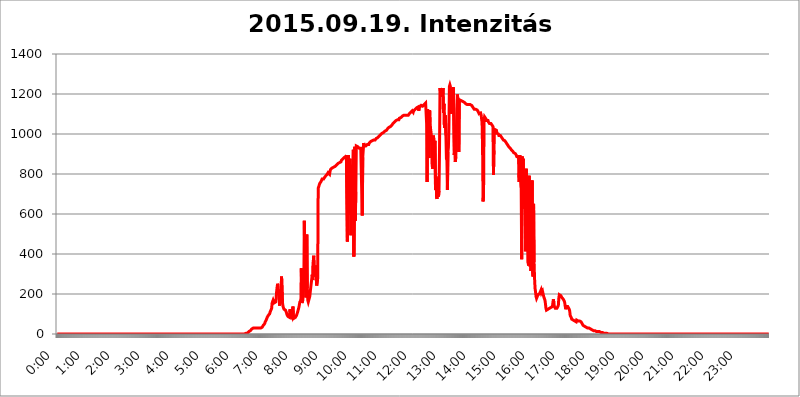
| Category | 2015.09.19. Intenzitás [W/m^2] |
|---|---|
| 0.0 | 0 |
| 0.0006944444444444445 | 0 |
| 0.001388888888888889 | 0 |
| 0.0020833333333333333 | 0 |
| 0.002777777777777778 | 0 |
| 0.003472222222222222 | 0 |
| 0.004166666666666667 | 0 |
| 0.004861111111111111 | 0 |
| 0.005555555555555556 | 0 |
| 0.0062499999999999995 | 0 |
| 0.006944444444444444 | 0 |
| 0.007638888888888889 | 0 |
| 0.008333333333333333 | 0 |
| 0.009027777777777779 | 0 |
| 0.009722222222222222 | 0 |
| 0.010416666666666666 | 0 |
| 0.011111111111111112 | 0 |
| 0.011805555555555555 | 0 |
| 0.012499999999999999 | 0 |
| 0.013194444444444444 | 0 |
| 0.013888888888888888 | 0 |
| 0.014583333333333332 | 0 |
| 0.015277777777777777 | 0 |
| 0.015972222222222224 | 0 |
| 0.016666666666666666 | 0 |
| 0.017361111111111112 | 0 |
| 0.018055555555555557 | 0 |
| 0.01875 | 0 |
| 0.019444444444444445 | 0 |
| 0.02013888888888889 | 0 |
| 0.020833333333333332 | 0 |
| 0.02152777777777778 | 0 |
| 0.022222222222222223 | 0 |
| 0.02291666666666667 | 0 |
| 0.02361111111111111 | 0 |
| 0.024305555555555556 | 0 |
| 0.024999999999999998 | 0 |
| 0.025694444444444447 | 0 |
| 0.02638888888888889 | 0 |
| 0.027083333333333334 | 0 |
| 0.027777777777777776 | 0 |
| 0.02847222222222222 | 0 |
| 0.029166666666666664 | 0 |
| 0.029861111111111113 | 0 |
| 0.030555555555555555 | 0 |
| 0.03125 | 0 |
| 0.03194444444444445 | 0 |
| 0.03263888888888889 | 0 |
| 0.03333333333333333 | 0 |
| 0.034027777777777775 | 0 |
| 0.034722222222222224 | 0 |
| 0.035416666666666666 | 0 |
| 0.036111111111111115 | 0 |
| 0.03680555555555556 | 0 |
| 0.0375 | 0 |
| 0.03819444444444444 | 0 |
| 0.03888888888888889 | 0 |
| 0.03958333333333333 | 0 |
| 0.04027777777777778 | 0 |
| 0.04097222222222222 | 0 |
| 0.041666666666666664 | 0 |
| 0.042361111111111106 | 0 |
| 0.04305555555555556 | 0 |
| 0.043750000000000004 | 0 |
| 0.044444444444444446 | 0 |
| 0.04513888888888889 | 0 |
| 0.04583333333333334 | 0 |
| 0.04652777777777778 | 0 |
| 0.04722222222222222 | 0 |
| 0.04791666666666666 | 0 |
| 0.04861111111111111 | 0 |
| 0.049305555555555554 | 0 |
| 0.049999999999999996 | 0 |
| 0.05069444444444445 | 0 |
| 0.051388888888888894 | 0 |
| 0.052083333333333336 | 0 |
| 0.05277777777777778 | 0 |
| 0.05347222222222222 | 0 |
| 0.05416666666666667 | 0 |
| 0.05486111111111111 | 0 |
| 0.05555555555555555 | 0 |
| 0.05625 | 0 |
| 0.05694444444444444 | 0 |
| 0.057638888888888885 | 0 |
| 0.05833333333333333 | 0 |
| 0.05902777777777778 | 0 |
| 0.059722222222222225 | 0 |
| 0.06041666666666667 | 0 |
| 0.061111111111111116 | 0 |
| 0.06180555555555556 | 0 |
| 0.0625 | 0 |
| 0.06319444444444444 | 0 |
| 0.06388888888888888 | 0 |
| 0.06458333333333334 | 0 |
| 0.06527777777777778 | 0 |
| 0.06597222222222222 | 0 |
| 0.06666666666666667 | 0 |
| 0.06736111111111111 | 0 |
| 0.06805555555555555 | 0 |
| 0.06874999999999999 | 0 |
| 0.06944444444444443 | 0 |
| 0.07013888888888889 | 0 |
| 0.07083333333333333 | 0 |
| 0.07152777777777779 | 0 |
| 0.07222222222222223 | 0 |
| 0.07291666666666667 | 0 |
| 0.07361111111111111 | 0 |
| 0.07430555555555556 | 0 |
| 0.075 | 0 |
| 0.07569444444444444 | 0 |
| 0.0763888888888889 | 0 |
| 0.07708333333333334 | 0 |
| 0.07777777777777778 | 0 |
| 0.07847222222222222 | 0 |
| 0.07916666666666666 | 0 |
| 0.0798611111111111 | 0 |
| 0.08055555555555556 | 0 |
| 0.08125 | 0 |
| 0.08194444444444444 | 0 |
| 0.08263888888888889 | 0 |
| 0.08333333333333333 | 0 |
| 0.08402777777777777 | 0 |
| 0.08472222222222221 | 0 |
| 0.08541666666666665 | 0 |
| 0.08611111111111112 | 0 |
| 0.08680555555555557 | 0 |
| 0.08750000000000001 | 0 |
| 0.08819444444444445 | 0 |
| 0.08888888888888889 | 0 |
| 0.08958333333333333 | 0 |
| 0.09027777777777778 | 0 |
| 0.09097222222222222 | 0 |
| 0.09166666666666667 | 0 |
| 0.09236111111111112 | 0 |
| 0.09305555555555556 | 0 |
| 0.09375 | 0 |
| 0.09444444444444444 | 0 |
| 0.09513888888888888 | 0 |
| 0.09583333333333333 | 0 |
| 0.09652777777777777 | 0 |
| 0.09722222222222222 | 0 |
| 0.09791666666666667 | 0 |
| 0.09861111111111111 | 0 |
| 0.09930555555555555 | 0 |
| 0.09999999999999999 | 0 |
| 0.10069444444444443 | 0 |
| 0.1013888888888889 | 0 |
| 0.10208333333333335 | 0 |
| 0.10277777777777779 | 0 |
| 0.10347222222222223 | 0 |
| 0.10416666666666667 | 0 |
| 0.10486111111111111 | 0 |
| 0.10555555555555556 | 0 |
| 0.10625 | 0 |
| 0.10694444444444444 | 0 |
| 0.1076388888888889 | 0 |
| 0.10833333333333334 | 0 |
| 0.10902777777777778 | 0 |
| 0.10972222222222222 | 0 |
| 0.1111111111111111 | 0 |
| 0.11180555555555556 | 0 |
| 0.11180555555555556 | 0 |
| 0.1125 | 0 |
| 0.11319444444444444 | 0 |
| 0.11388888888888889 | 0 |
| 0.11458333333333333 | 0 |
| 0.11527777777777777 | 0 |
| 0.11597222222222221 | 0 |
| 0.11666666666666665 | 0 |
| 0.1173611111111111 | 0 |
| 0.11805555555555557 | 0 |
| 0.11944444444444445 | 0 |
| 0.12013888888888889 | 0 |
| 0.12083333333333333 | 0 |
| 0.12152777777777778 | 0 |
| 0.12222222222222223 | 0 |
| 0.12291666666666667 | 0 |
| 0.12291666666666667 | 0 |
| 0.12361111111111112 | 0 |
| 0.12430555555555556 | 0 |
| 0.125 | 0 |
| 0.12569444444444444 | 0 |
| 0.12638888888888888 | 0 |
| 0.12708333333333333 | 0 |
| 0.16875 | 0 |
| 0.12847222222222224 | 0 |
| 0.12916666666666668 | 0 |
| 0.12986111111111112 | 0 |
| 0.13055555555555556 | 0 |
| 0.13125 | 0 |
| 0.13194444444444445 | 0 |
| 0.1326388888888889 | 0 |
| 0.13333333333333333 | 0 |
| 0.13402777777777777 | 0 |
| 0.13402777777777777 | 0 |
| 0.13472222222222222 | 0 |
| 0.13541666666666666 | 0 |
| 0.1361111111111111 | 0 |
| 0.13749999999999998 | 0 |
| 0.13819444444444443 | 0 |
| 0.1388888888888889 | 0 |
| 0.13958333333333334 | 0 |
| 0.14027777777777778 | 0 |
| 0.14097222222222222 | 0 |
| 0.14166666666666666 | 0 |
| 0.1423611111111111 | 0 |
| 0.14305555555555557 | 0 |
| 0.14375000000000002 | 0 |
| 0.14444444444444446 | 0 |
| 0.1451388888888889 | 0 |
| 0.1451388888888889 | 0 |
| 0.14652777777777778 | 0 |
| 0.14722222222222223 | 0 |
| 0.14791666666666667 | 0 |
| 0.1486111111111111 | 0 |
| 0.14930555555555555 | 0 |
| 0.15 | 0 |
| 0.15069444444444444 | 0 |
| 0.15138888888888888 | 0 |
| 0.15208333333333332 | 0 |
| 0.15277777777777776 | 0 |
| 0.15347222222222223 | 0 |
| 0.15416666666666667 | 0 |
| 0.15486111111111112 | 0 |
| 0.15555555555555556 | 0 |
| 0.15625 | 0 |
| 0.15694444444444444 | 0 |
| 0.15763888888888888 | 0 |
| 0.15833333333333333 | 0 |
| 0.15902777777777777 | 0 |
| 0.15972222222222224 | 0 |
| 0.16041666666666668 | 0 |
| 0.16111111111111112 | 0 |
| 0.16180555555555556 | 0 |
| 0.1625 | 0 |
| 0.16319444444444445 | 0 |
| 0.1638888888888889 | 0 |
| 0.16458333333333333 | 0 |
| 0.16527777777777777 | 0 |
| 0.16597222222222222 | 0 |
| 0.16666666666666666 | 0 |
| 0.1673611111111111 | 0 |
| 0.16805555555555554 | 0 |
| 0.16874999999999998 | 0 |
| 0.16944444444444443 | 0 |
| 0.17013888888888887 | 0 |
| 0.1708333333333333 | 0 |
| 0.17152777777777775 | 0 |
| 0.17222222222222225 | 0 |
| 0.1729166666666667 | 0 |
| 0.17361111111111113 | 0 |
| 0.17430555555555557 | 0 |
| 0.17500000000000002 | 0 |
| 0.17569444444444446 | 0 |
| 0.1763888888888889 | 0 |
| 0.17708333333333334 | 0 |
| 0.17777777777777778 | 0 |
| 0.17847222222222223 | 0 |
| 0.17916666666666667 | 0 |
| 0.1798611111111111 | 0 |
| 0.18055555555555555 | 0 |
| 0.18125 | 0 |
| 0.18194444444444444 | 0 |
| 0.1826388888888889 | 0 |
| 0.18333333333333335 | 0 |
| 0.1840277777777778 | 0 |
| 0.18472222222222223 | 0 |
| 0.18541666666666667 | 0 |
| 0.18611111111111112 | 0 |
| 0.18680555555555556 | 0 |
| 0.1875 | 0 |
| 0.18819444444444444 | 0 |
| 0.18888888888888888 | 0 |
| 0.18958333333333333 | 0 |
| 0.19027777777777777 | 0 |
| 0.1909722222222222 | 0 |
| 0.19166666666666665 | 0 |
| 0.19236111111111112 | 0 |
| 0.19305555555555554 | 0 |
| 0.19375 | 0 |
| 0.19444444444444445 | 0 |
| 0.1951388888888889 | 0 |
| 0.19583333333333333 | 0 |
| 0.19652777777777777 | 0 |
| 0.19722222222222222 | 0 |
| 0.19791666666666666 | 0 |
| 0.1986111111111111 | 0 |
| 0.19930555555555554 | 0 |
| 0.19999999999999998 | 0 |
| 0.20069444444444443 | 0 |
| 0.20138888888888887 | 0 |
| 0.2020833333333333 | 0 |
| 0.2027777777777778 | 0 |
| 0.2034722222222222 | 0 |
| 0.2041666666666667 | 0 |
| 0.20486111111111113 | 0 |
| 0.20555555555555557 | 0 |
| 0.20625000000000002 | 0 |
| 0.20694444444444446 | 0 |
| 0.2076388888888889 | 0 |
| 0.20833333333333334 | 0 |
| 0.20902777777777778 | 0 |
| 0.20972222222222223 | 0 |
| 0.21041666666666667 | 0 |
| 0.2111111111111111 | 0 |
| 0.21180555555555555 | 0 |
| 0.2125 | 0 |
| 0.21319444444444444 | 0 |
| 0.2138888888888889 | 0 |
| 0.21458333333333335 | 0 |
| 0.2152777777777778 | 0 |
| 0.21597222222222223 | 0 |
| 0.21666666666666667 | 0 |
| 0.21736111111111112 | 0 |
| 0.21805555555555556 | 0 |
| 0.21875 | 0 |
| 0.21944444444444444 | 0 |
| 0.22013888888888888 | 0 |
| 0.22083333333333333 | 0 |
| 0.22152777777777777 | 0 |
| 0.2222222222222222 | 0 |
| 0.22291666666666665 | 0 |
| 0.2236111111111111 | 0 |
| 0.22430555555555556 | 0 |
| 0.225 | 0 |
| 0.22569444444444445 | 0 |
| 0.2263888888888889 | 0 |
| 0.22708333333333333 | 0 |
| 0.22777777777777777 | 0 |
| 0.22847222222222222 | 0 |
| 0.22916666666666666 | 0 |
| 0.2298611111111111 | 0 |
| 0.23055555555555554 | 0 |
| 0.23124999999999998 | 0 |
| 0.23194444444444443 | 0 |
| 0.23263888888888887 | 0 |
| 0.2333333333333333 | 0 |
| 0.2340277777777778 | 0 |
| 0.2347222222222222 | 0 |
| 0.2354166666666667 | 0 |
| 0.23611111111111113 | 0 |
| 0.23680555555555557 | 0 |
| 0.23750000000000002 | 0 |
| 0.23819444444444446 | 0 |
| 0.2388888888888889 | 0 |
| 0.23958333333333334 | 0 |
| 0.24027777777777778 | 0 |
| 0.24097222222222223 | 0 |
| 0.24166666666666667 | 0 |
| 0.2423611111111111 | 0 |
| 0.24305555555555555 | 0 |
| 0.24375 | 0 |
| 0.24444444444444446 | 0 |
| 0.24513888888888888 | 0 |
| 0.24583333333333335 | 0 |
| 0.2465277777777778 | 0 |
| 0.24722222222222223 | 0 |
| 0.24791666666666667 | 0 |
| 0.24861111111111112 | 0 |
| 0.24930555555555556 | 0 |
| 0.25 | 0 |
| 0.25069444444444444 | 0 |
| 0.2513888888888889 | 0 |
| 0.2520833333333333 | 0 |
| 0.25277777777777777 | 0 |
| 0.2534722222222222 | 0 |
| 0.25416666666666665 | 0 |
| 0.2548611111111111 | 0 |
| 0.2555555555555556 | 0 |
| 0.25625000000000003 | 0 |
| 0.2569444444444445 | 0 |
| 0.2576388888888889 | 0 |
| 0.25833333333333336 | 0 |
| 0.2590277777777778 | 0 |
| 0.25972222222222224 | 0 |
| 0.2604166666666667 | 0 |
| 0.2611111111111111 | 0 |
| 0.26180555555555557 | 0 |
| 0.2625 | 0 |
| 0.26319444444444445 | 3.525 |
| 0.2638888888888889 | 3.525 |
| 0.26458333333333334 | 3.525 |
| 0.2652777777777778 | 3.525 |
| 0.2659722222222222 | 3.525 |
| 0.26666666666666666 | 3.525 |
| 0.2673611111111111 | 7.887 |
| 0.26805555555555555 | 7.887 |
| 0.26875 | 12.257 |
| 0.26944444444444443 | 12.257 |
| 0.2701388888888889 | 12.257 |
| 0.2708333333333333 | 16.636 |
| 0.27152777777777776 | 21.024 |
| 0.2722222222222222 | 21.024 |
| 0.27291666666666664 | 25.419 |
| 0.2736111111111111 | 25.419 |
| 0.2743055555555555 | 29.823 |
| 0.27499999999999997 | 29.823 |
| 0.27569444444444446 | 29.823 |
| 0.27638888888888885 | 29.823 |
| 0.27708333333333335 | 29.823 |
| 0.2777777777777778 | 29.823 |
| 0.27847222222222223 | 29.823 |
| 0.2791666666666667 | 29.823 |
| 0.2798611111111111 | 29.823 |
| 0.28055555555555556 | 29.823 |
| 0.28125 | 29.823 |
| 0.28194444444444444 | 29.823 |
| 0.2826388888888889 | 29.823 |
| 0.2833333333333333 | 29.823 |
| 0.28402777777777777 | 29.823 |
| 0.2847222222222222 | 29.823 |
| 0.28541666666666665 | 29.823 |
| 0.28611111111111115 | 29.823 |
| 0.28680555555555554 | 34.234 |
| 0.28750000000000003 | 34.234 |
| 0.2881944444444445 | 38.653 |
| 0.2888888888888889 | 43.079 |
| 0.28958333333333336 | 47.511 |
| 0.2902777777777778 | 47.511 |
| 0.29097222222222224 | 51.951 |
| 0.2916666666666667 | 60.85 |
| 0.2923611111111111 | 65.31 |
| 0.29305555555555557 | 69.775 |
| 0.29375 | 74.246 |
| 0.29444444444444445 | 83.205 |
| 0.2951388888888889 | 87.692 |
| 0.29583333333333334 | 92.184 |
| 0.2965277777777778 | 92.184 |
| 0.2972222222222222 | 96.682 |
| 0.29791666666666666 | 101.184 |
| 0.2986111111111111 | 110.201 |
| 0.29930555555555555 | 114.716 |
| 0.3 | 110.201 |
| 0.30069444444444443 | 128.284 |
| 0.3013888888888889 | 155.509 |
| 0.3020833333333333 | 155.509 |
| 0.30277777777777776 | 169.156 |
| 0.3034722222222222 | 164.605 |
| 0.30416666666666664 | 155.509 |
| 0.3048611111111111 | 155.509 |
| 0.3055555555555555 | 150.964 |
| 0.30624999999999997 | 160.056 |
| 0.3069444444444444 | 173.709 |
| 0.3076388888888889 | 210.182 |
| 0.30833333333333335 | 233 |
| 0.3090277777777778 | 251.251 |
| 0.30972222222222223 | 242.127 |
| 0.3104166666666667 | 210.182 |
| 0.3111111111111111 | 173.709 |
| 0.31180555555555556 | 141.884 |
| 0.3125 | 137.347 |
| 0.31319444444444444 | 146.423 |
| 0.3138888888888889 | 214.746 |
| 0.3145833333333333 | 287.709 |
| 0.31527777777777777 | 283.156 |
| 0.3159722222222222 | 155.509 |
| 0.31666666666666665 | 137.347 |
| 0.31736111111111115 | 132.814 |
| 0.31805555555555554 | 123.758 |
| 0.31875000000000003 | 119.235 |
| 0.3194444444444445 | 119.235 |
| 0.3201388888888889 | 119.235 |
| 0.32083333333333336 | 114.716 |
| 0.3215277777777778 | 105.69 |
| 0.32222222222222224 | 96.682 |
| 0.3229166666666667 | 92.184 |
| 0.3236111111111111 | 87.692 |
| 0.32430555555555557 | 83.205 |
| 0.325 | 83.205 |
| 0.32569444444444445 | 83.205 |
| 0.3263888888888889 | 123.758 |
| 0.32708333333333334 | 123.758 |
| 0.3277777777777778 | 92.184 |
| 0.3284722222222222 | 87.692 |
| 0.32916666666666666 | 83.205 |
| 0.3298611111111111 | 87.692 |
| 0.33055555555555555 | 137.347 |
| 0.33125 | 87.692 |
| 0.33194444444444443 | 78.722 |
| 0.3326388888888889 | 78.722 |
| 0.3333333333333333 | 83.205 |
| 0.3340277777777778 | 83.205 |
| 0.3347222222222222 | 87.692 |
| 0.3354166666666667 | 92.184 |
| 0.3361111111111111 | 96.682 |
| 0.3368055555555556 | 105.69 |
| 0.33749999999999997 | 114.716 |
| 0.33819444444444446 | 123.758 |
| 0.33888888888888885 | 132.814 |
| 0.33958333333333335 | 146.423 |
| 0.34027777777777773 | 160.056 |
| 0.34097222222222223 | 164.605 |
| 0.3416666666666666 | 169.156 |
| 0.3423611111111111 | 328.584 |
| 0.3430555555555555 | 155.509 |
| 0.34375 | 155.509 |
| 0.3444444444444445 | 169.156 |
| 0.3451388888888889 | 210.182 |
| 0.3458333333333334 | 251.251 |
| 0.34652777777777777 | 566.793 |
| 0.34722222222222227 | 328.584 |
| 0.34791666666666665 | 242.127 |
| 0.34861111111111115 | 182.82 |
| 0.34930555555555554 | 196.497 |
| 0.35000000000000003 | 497.836 |
| 0.3506944444444444 | 233 |
| 0.3513888888888889 | 169.156 |
| 0.3520833333333333 | 160.056 |
| 0.3527777777777778 | 169.156 |
| 0.3534722222222222 | 173.709 |
| 0.3541666666666667 | 187.378 |
| 0.3548611111111111 | 191.937 |
| 0.35555555555555557 | 233 |
| 0.35625 | 228.436 |
| 0.35694444444444445 | 228.436 |
| 0.3576388888888889 | 296.808 |
| 0.35833333333333334 | 269.49 |
| 0.3590277777777778 | 360.221 |
| 0.3597222222222222 | 391.685 |
| 0.36041666666666666 | 314.98 |
| 0.3611111111111111 | 328.584 |
| 0.36180555555555555 | 287.709 |
| 0.3625 | 342.162 |
| 0.36319444444444443 | 278.603 |
| 0.3638888888888889 | 242.127 |
| 0.3645833333333333 | 237.564 |
| 0.3652777777777778 | 278.603 |
| 0.3659722222222222 | 727.896 |
| 0.3666666666666667 | 735.89 |
| 0.3673611111111111 | 743.859 |
| 0.3680555555555556 | 751.803 |
| 0.36874999999999997 | 755.766 |
| 0.36944444444444446 | 755.766 |
| 0.37013888888888885 | 763.674 |
| 0.37083333333333335 | 767.62 |
| 0.37152777777777773 | 775.492 |
| 0.37222222222222223 | 775.492 |
| 0.3729166666666666 | 775.492 |
| 0.3736111111111111 | 775.492 |
| 0.3743055555555555 | 775.492 |
| 0.375 | 779.42 |
| 0.3756944444444445 | 787.258 |
| 0.3763888888888889 | 787.258 |
| 0.3770833333333334 | 787.258 |
| 0.37777777777777777 | 795.074 |
| 0.37847222222222227 | 795.074 |
| 0.37916666666666665 | 798.974 |
| 0.37986111111111115 | 806.757 |
| 0.38055555555555554 | 806.757 |
| 0.38125000000000003 | 806.757 |
| 0.3819444444444444 | 798.974 |
| 0.3826388888888889 | 814.519 |
| 0.3833333333333333 | 822.26 |
| 0.3840277777777778 | 822.26 |
| 0.3847222222222222 | 826.123 |
| 0.3854166666666667 | 829.981 |
| 0.3861111111111111 | 829.981 |
| 0.38680555555555557 | 833.834 |
| 0.3875 | 833.834 |
| 0.38819444444444445 | 833.834 |
| 0.3888888888888889 | 833.834 |
| 0.38958333333333334 | 837.682 |
| 0.3902777777777778 | 837.682 |
| 0.3909722222222222 | 841.526 |
| 0.39166666666666666 | 845.365 |
| 0.3923611111111111 | 845.365 |
| 0.39305555555555555 | 845.365 |
| 0.39375 | 853.029 |
| 0.39444444444444443 | 853.029 |
| 0.3951388888888889 | 853.029 |
| 0.3958333333333333 | 856.855 |
| 0.3965277777777778 | 860.676 |
| 0.3972222222222222 | 860.676 |
| 0.3979166666666667 | 860.676 |
| 0.3986111111111111 | 868.305 |
| 0.3993055555555556 | 868.305 |
| 0.39999999999999997 | 872.114 |
| 0.40069444444444446 | 875.918 |
| 0.40138888888888885 | 875.918 |
| 0.40208333333333335 | 879.719 |
| 0.40277777777777773 | 883.516 |
| 0.40347222222222223 | 887.309 |
| 0.4041666666666666 | 887.309 |
| 0.4048611111111111 | 887.309 |
| 0.4055555555555555 | 894.885 |
| 0.40625 | 894.885 |
| 0.4069444444444445 | 462.786 |
| 0.4076388888888889 | 868.305 |
| 0.4083333333333334 | 894.885 |
| 0.40902777777777777 | 795.074 |
| 0.40972222222222227 | 596.45 |
| 0.41041666666666665 | 875.918 |
| 0.41111111111111115 | 826.123 |
| 0.41180555555555554 | 493.475 |
| 0.41250000000000003 | 845.365 |
| 0.4131944444444444 | 711.832 |
| 0.4138888888888889 | 683.473 |
| 0.4145833333333333 | 814.519 |
| 0.4152777777777778 | 921.298 |
| 0.4159722222222222 | 387.202 |
| 0.4166666666666667 | 588.009 |
| 0.4173611111111111 | 936.33 |
| 0.41805555555555557 | 566.793 |
| 0.41875 | 711.832 |
| 0.41944444444444445 | 940.082 |
| 0.4201388888888889 | 943.832 |
| 0.42083333333333334 | 940.082 |
| 0.4215277777777778 | 936.33 |
| 0.4222222222222222 | 932.576 |
| 0.42291666666666666 | 932.576 |
| 0.4236111111111111 | 928.819 |
| 0.42430555555555555 | 928.819 |
| 0.425 | 928.819 |
| 0.42569444444444443 | 928.819 |
| 0.4263888888888889 | 932.576 |
| 0.4270833333333333 | 932.576 |
| 0.4277777777777778 | 592.233 |
| 0.4284722222222222 | 883.516 |
| 0.4291666666666667 | 879.719 |
| 0.4298611111111111 | 955.071 |
| 0.4305555555555556 | 940.082 |
| 0.43124999999999997 | 940.082 |
| 0.43194444444444446 | 943.832 |
| 0.43263888888888885 | 940.082 |
| 0.43333333333333335 | 943.832 |
| 0.43402777777777773 | 943.832 |
| 0.43472222222222223 | 947.58 |
| 0.4354166666666666 | 947.58 |
| 0.4361111111111111 | 947.58 |
| 0.4368055555555555 | 947.58 |
| 0.4375 | 955.071 |
| 0.4381944444444445 | 958.814 |
| 0.4388888888888889 | 958.814 |
| 0.4395833333333334 | 962.555 |
| 0.44027777777777777 | 966.295 |
| 0.44097222222222227 | 966.295 |
| 0.44166666666666665 | 966.295 |
| 0.44236111111111115 | 966.295 |
| 0.44305555555555554 | 970.034 |
| 0.44375000000000003 | 970.034 |
| 0.4444444444444444 | 966.295 |
| 0.4451388888888889 | 970.034 |
| 0.4458333333333333 | 970.034 |
| 0.4465277777777778 | 973.772 |
| 0.4472222222222222 | 977.508 |
| 0.4479166666666667 | 977.508 |
| 0.4486111111111111 | 977.508 |
| 0.44930555555555557 | 981.244 |
| 0.45 | 984.98 |
| 0.45069444444444445 | 984.98 |
| 0.4513888888888889 | 988.714 |
| 0.45208333333333334 | 992.448 |
| 0.4527777777777778 | 992.448 |
| 0.4534722222222222 | 996.182 |
| 0.45416666666666666 | 996.182 |
| 0.4548611111111111 | 999.916 |
| 0.45555555555555555 | 1003.65 |
| 0.45625 | 999.916 |
| 0.45694444444444443 | 1007.383 |
| 0.4576388888888889 | 1007.383 |
| 0.4583333333333333 | 1007.383 |
| 0.4590277777777778 | 1011.118 |
| 0.4597222222222222 | 1014.852 |
| 0.4604166666666667 | 1014.852 |
| 0.4611111111111111 | 1014.852 |
| 0.4618055555555556 | 1018.587 |
| 0.46249999999999997 | 1022.323 |
| 0.46319444444444446 | 1026.06 |
| 0.46388888888888885 | 1029.798 |
| 0.46458333333333335 | 1029.798 |
| 0.46527777777777773 | 1033.537 |
| 0.46597222222222223 | 1033.537 |
| 0.4666666666666666 | 1033.537 |
| 0.4673611111111111 | 1037.277 |
| 0.4680555555555555 | 1037.277 |
| 0.46875 | 1041.019 |
| 0.4694444444444445 | 1044.762 |
| 0.4701388888888889 | 1044.762 |
| 0.4708333333333334 | 1052.255 |
| 0.47152777777777777 | 1052.255 |
| 0.47222222222222227 | 1056.004 |
| 0.47291666666666665 | 1059.756 |
| 0.47361111111111115 | 1059.756 |
| 0.47430555555555554 | 1063.51 |
| 0.47500000000000003 | 1067.267 |
| 0.4756944444444444 | 1067.267 |
| 0.4763888888888889 | 1067.267 |
| 0.4770833333333333 | 1071.027 |
| 0.4777777777777778 | 1071.027 |
| 0.4784722222222222 | 1071.027 |
| 0.4791666666666667 | 1071.027 |
| 0.4798611111111111 | 1078.555 |
| 0.48055555555555557 | 1078.555 |
| 0.48125 | 1082.324 |
| 0.48194444444444445 | 1082.324 |
| 0.4826388888888889 | 1086.097 |
| 0.48333333333333334 | 1086.097 |
| 0.4840277777777778 | 1089.873 |
| 0.4847222222222222 | 1093.653 |
| 0.48541666666666666 | 1093.653 |
| 0.4861111111111111 | 1093.653 |
| 0.48680555555555555 | 1093.653 |
| 0.4875 | 1093.653 |
| 0.48819444444444443 | 1093.653 |
| 0.4888888888888889 | 1089.873 |
| 0.4895833333333333 | 1089.873 |
| 0.4902777777777778 | 1093.653 |
| 0.4909722222222222 | 1097.437 |
| 0.4916666666666667 | 1097.437 |
| 0.4923611111111111 | 1093.653 |
| 0.4930555555555556 | 1097.437 |
| 0.49374999999999997 | 1101.226 |
| 0.49444444444444446 | 1105.019 |
| 0.49513888888888885 | 1105.019 |
| 0.49583333333333335 | 1108.816 |
| 0.49652777777777773 | 1112.618 |
| 0.49722222222222223 | 1112.618 |
| 0.4979166666666666 | 1116.426 |
| 0.4986111111111111 | 1112.618 |
| 0.4993055555555555 | 1108.816 |
| 0.5 | 1116.426 |
| 0.5006944444444444 | 1116.426 |
| 0.5013888888888889 | 1116.426 |
| 0.5020833333333333 | 1124.056 |
| 0.5027777777777778 | 1124.056 |
| 0.5034722222222222 | 1127.879 |
| 0.5041666666666667 | 1131.708 |
| 0.5048611111111111 | 1127.879 |
| 0.5055555555555555 | 1131.708 |
| 0.50625 | 1135.543 |
| 0.5069444444444444 | 1116.426 |
| 0.5076388888888889 | 1127.879 |
| 0.5083333333333333 | 1135.543 |
| 0.5090277777777777 | 1131.708 |
| 0.5097222222222222 | 1139.384 |
| 0.5104166666666666 | 1143.232 |
| 0.5111111111111112 | 1143.232 |
| 0.5118055555555555 | 1143.232 |
| 0.5125000000000001 | 1139.384 |
| 0.5131944444444444 | 1139.384 |
| 0.513888888888889 | 1143.232 |
| 0.5145833333333333 | 1147.086 |
| 0.5152777777777778 | 1147.086 |
| 0.5159722222222222 | 1147.086 |
| 0.5166666666666667 | 1154.814 |
| 0.517361111111111 | 1154.814 |
| 0.5180555555555556 | 1052.255 |
| 0.5187499999999999 | 759.723 |
| 0.5194444444444445 | 1124.056 |
| 0.5201388888888888 | 977.508 |
| 0.5208333333333334 | 925.06 |
| 0.5215277777777778 | 879.719 |
| 0.5222222222222223 | 1120.238 |
| 0.5229166666666667 | 1056.004 |
| 0.5236111111111111 | 1026.06 |
| 0.5243055555555556 | 1007.383 |
| 0.525 | 973.772 |
| 0.5256944444444445 | 853.029 |
| 0.5263888888888889 | 826.123 |
| 0.5270833333333333 | 906.223 |
| 0.5277777777777778 | 992.448 |
| 0.5284722222222222 | 917.534 |
| 0.5291666666666667 | 955.071 |
| 0.5298611111111111 | 966.295 |
| 0.5305555555555556 | 719.877 |
| 0.53125 | 787.258 |
| 0.5319444444444444 | 687.544 |
| 0.5326388888888889 | 675.311 |
| 0.5333333333333333 | 723.889 |
| 0.5340277777777778 | 779.42 |
| 0.5347222222222222 | 687.544 |
| 0.5354166666666667 | 715.858 |
| 0.5361111111111111 | 909.996 |
| 0.5368055555555555 | 1229.899 |
| 0.5375 | 1213.804 |
| 0.5381944444444444 | 1225.859 |
| 0.5388888888888889 | 1225.859 |
| 0.5395833333333333 | 1221.83 |
| 0.5402777777777777 | 1186.03 |
| 0.5409722222222222 | 1229.899 |
| 0.5416666666666666 | 1105.019 |
| 0.5423611111111112 | 1150.946 |
| 0.5430555555555555 | 1029.798 |
| 0.5437500000000001 | 1086.097 |
| 0.5444444444444444 | 1093.653 |
| 0.545138888888889 | 992.448 |
| 0.5458333333333333 | 875.918 |
| 0.5465277777777778 | 868.305 |
| 0.5472222222222222 | 719.877 |
| 0.5479166666666667 | 909.996 |
| 0.548611111111111 | 932.576 |
| 0.5493055555555556 | 1029.798 |
| 0.5499999999999999 | 1238.014 |
| 0.5506944444444445 | 1246.176 |
| 0.5513888888888888 | 1238.014 |
| 0.5520833333333334 | 1154.814 |
| 0.5527777777777778 | 1101.226 |
| 0.5534722222222223 | 1229.899 |
| 0.5541666666666667 | 1108.816 |
| 0.5548611111111111 | 1221.83 |
| 0.5555555555555556 | 1233.951 |
| 0.55625 | 1229.899 |
| 0.5569444444444445 | 894.885 |
| 0.5576388888888889 | 1014.852 |
| 0.5583333333333333 | 860.676 |
| 0.5590277777777778 | 887.309 |
| 0.5597222222222222 | 891.099 |
| 0.5604166666666667 | 1116.426 |
| 0.5611111111111111 | 1197.876 |
| 0.5618055555555556 | 1178.177 |
| 0.5625 | 1170.358 |
| 0.5631944444444444 | 909.996 |
| 0.5638888888888889 | 1162.571 |
| 0.5645833333333333 | 1170.358 |
| 0.5652777777777778 | 1170.358 |
| 0.5659722222222222 | 1170.358 |
| 0.5666666666666667 | 1166.46 |
| 0.5673611111111111 | 1166.46 |
| 0.5680555555555555 | 1162.571 |
| 0.56875 | 1162.571 |
| 0.5694444444444444 | 1162.571 |
| 0.5701388888888889 | 1162.571 |
| 0.5708333333333333 | 1158.689 |
| 0.5715277777777777 | 1158.689 |
| 0.5722222222222222 | 1154.814 |
| 0.5729166666666666 | 1150.946 |
| 0.5736111111111112 | 1147.086 |
| 0.5743055555555555 | 1147.086 |
| 0.5750000000000001 | 1147.086 |
| 0.5756944444444444 | 1150.946 |
| 0.576388888888889 | 1147.086 |
| 0.5770833333333333 | 1147.086 |
| 0.5777777777777778 | 1147.086 |
| 0.5784722222222222 | 1147.086 |
| 0.5791666666666667 | 1147.086 |
| 0.579861111111111 | 1147.086 |
| 0.5805555555555556 | 1147.086 |
| 0.5812499999999999 | 1143.232 |
| 0.5819444444444445 | 1139.384 |
| 0.5826388888888888 | 1139.384 |
| 0.5833333333333334 | 1131.708 |
| 0.5840277777777778 | 1127.879 |
| 0.5847222222222223 | 1124.056 |
| 0.5854166666666667 | 1127.879 |
| 0.5861111111111111 | 1127.879 |
| 0.5868055555555556 | 1124.056 |
| 0.5875 | 1120.238 |
| 0.5881944444444445 | 1120.238 |
| 0.5888888888888889 | 1120.238 |
| 0.5895833333333333 | 1116.426 |
| 0.5902777777777778 | 1112.618 |
| 0.5909722222222222 | 1108.816 |
| 0.5916666666666667 | 1101.226 |
| 0.5923611111111111 | 1105.019 |
| 0.5930555555555556 | 1101.226 |
| 0.59375 | 1105.019 |
| 0.5944444444444444 | 1097.437 |
| 0.5951388888888889 | 1093.653 |
| 0.5958333333333333 | 1056.004 |
| 0.5965277777777778 | 925.06 |
| 0.5972222222222222 | 663.019 |
| 0.5979166666666667 | 691.608 |
| 0.5986111111111111 | 1071.027 |
| 0.5993055555555555 | 1086.097 |
| 0.6 | 1089.873 |
| 0.6006944444444444 | 1086.097 |
| 0.6013888888888889 | 1074.789 |
| 0.6020833333333333 | 1067.267 |
| 0.6027777777777777 | 1067.267 |
| 0.6034722222222222 | 1067.267 |
| 0.6041666666666666 | 1067.267 |
| 0.6048611111111112 | 1059.756 |
| 0.6055555555555555 | 1056.004 |
| 0.6062500000000001 | 1052.255 |
| 0.6069444444444444 | 1048.508 |
| 0.607638888888889 | 1048.508 |
| 0.6083333333333333 | 1052.255 |
| 0.6090277777777778 | 1052.255 |
| 0.6097222222222222 | 1044.762 |
| 0.6104166666666667 | 1041.019 |
| 0.611111111111111 | 1037.277 |
| 0.6118055555555556 | 795.074 |
| 0.6124999999999999 | 917.534 |
| 0.6131944444444445 | 1011.118 |
| 0.6138888888888888 | 1022.323 |
| 0.6145833333333334 | 1022.323 |
| 0.6152777777777778 | 1018.587 |
| 0.6159722222222223 | 1018.587 |
| 0.6166666666666667 | 1003.65 |
| 0.6173611111111111 | 999.916 |
| 0.6180555555555556 | 999.916 |
| 0.61875 | 999.916 |
| 0.6194444444444445 | 992.448 |
| 0.6201388888888889 | 992.448 |
| 0.6208333333333333 | 992.448 |
| 0.6215277777777778 | 992.448 |
| 0.6222222222222222 | 992.448 |
| 0.6229166666666667 | 984.98 |
| 0.6236111111111111 | 981.244 |
| 0.6243055555555556 | 977.508 |
| 0.625 | 977.508 |
| 0.6256944444444444 | 970.034 |
| 0.6263888888888889 | 973.772 |
| 0.6270833333333333 | 970.034 |
| 0.6277777777777778 | 966.295 |
| 0.6284722222222222 | 966.295 |
| 0.6291666666666667 | 962.555 |
| 0.6298611111111111 | 955.071 |
| 0.6305555555555555 | 951.327 |
| 0.63125 | 947.58 |
| 0.6319444444444444 | 947.58 |
| 0.6326388888888889 | 943.832 |
| 0.6333333333333333 | 936.33 |
| 0.6340277777777777 | 932.576 |
| 0.6347222222222222 | 932.576 |
| 0.6354166666666666 | 928.819 |
| 0.6361111111111112 | 925.06 |
| 0.6368055555555555 | 921.298 |
| 0.6375000000000001 | 917.534 |
| 0.6381944444444444 | 917.534 |
| 0.638888888888889 | 913.766 |
| 0.6395833333333333 | 909.996 |
| 0.6402777777777778 | 906.223 |
| 0.6409722222222222 | 906.223 |
| 0.6416666666666667 | 902.447 |
| 0.642361111111111 | 902.447 |
| 0.6430555555555556 | 898.668 |
| 0.6437499999999999 | 894.885 |
| 0.6444444444444445 | 887.309 |
| 0.6451388888888888 | 891.099 |
| 0.6458333333333334 | 887.309 |
| 0.6465277777777778 | 883.516 |
| 0.6472222222222223 | 891.099 |
| 0.6479166666666667 | 759.723 |
| 0.6486111111111111 | 894.885 |
| 0.6493055555555556 | 898.668 |
| 0.65 | 894.885 |
| 0.6506944444444445 | 731.896 |
| 0.6513888888888889 | 373.729 |
| 0.6520833333333333 | 887.309 |
| 0.6527777777777778 | 771.559 |
| 0.6534722222222222 | 875.918 |
| 0.6541666666666667 | 646.537 |
| 0.6548611111111111 | 806.757 |
| 0.6555555555555556 | 625.784 |
| 0.65625 | 671.22 |
| 0.6569444444444444 | 414.035 |
| 0.6576388888888889 | 826.123 |
| 0.6583333333333333 | 743.859 |
| 0.6590277777777778 | 449.551 |
| 0.6597222222222222 | 646.537 |
| 0.6604166666666667 | 355.712 |
| 0.6611111111111111 | 342.162 |
| 0.6618055555555555 | 791.169 |
| 0.6625 | 629.948 |
| 0.6631944444444444 | 337.639 |
| 0.6638888888888889 | 373.729 |
| 0.6645833333333333 | 314.98 |
| 0.6652777777777777 | 314.98 |
| 0.6659722222222222 | 767.62 |
| 0.6666666666666666 | 305.898 |
| 0.6673611111111111 | 287.709 |
| 0.6680555555555556 | 650.667 |
| 0.6687500000000001 | 360.221 |
| 0.6694444444444444 | 278.603 |
| 0.6701388888888888 | 228.436 |
| 0.6708333333333334 | 210.182 |
| 0.6715277777777778 | 187.378 |
| 0.6722222222222222 | 178.264 |
| 0.6729166666666666 | 173.709 |
| 0.6736111111111112 | 182.82 |
| 0.6743055555555556 | 196.497 |
| 0.6749999999999999 | 196.497 |
| 0.6756944444444444 | 196.497 |
| 0.6763888888888889 | 201.058 |
| 0.6770833333333334 | 205.62 |
| 0.6777777777777777 | 205.62 |
| 0.6784722222222223 | 219.309 |
| 0.6791666666666667 | 205.62 |
| 0.6798611111111111 | 210.182 |
| 0.6805555555555555 | 214.746 |
| 0.68125 | 210.182 |
| 0.6819444444444445 | 191.937 |
| 0.6826388888888889 | 182.82 |
| 0.6833333333333332 | 182.82 |
| 0.6840277777777778 | 169.156 |
| 0.6847222222222222 | 150.964 |
| 0.6854166666666667 | 128.284 |
| 0.686111111111111 | 119.235 |
| 0.6868055555555556 | 119.235 |
| 0.6875 | 119.235 |
| 0.6881944444444444 | 123.758 |
| 0.688888888888889 | 128.284 |
| 0.6895833333333333 | 128.284 |
| 0.6902777777777778 | 128.284 |
| 0.6909722222222222 | 128.284 |
| 0.6916666666666668 | 128.284 |
| 0.6923611111111111 | 132.814 |
| 0.6930555555555555 | 132.814 |
| 0.69375 | 132.814 |
| 0.6944444444444445 | 137.347 |
| 0.6951388888888889 | 137.347 |
| 0.6958333333333333 | 173.709 |
| 0.6965277777777777 | 155.509 |
| 0.6972222222222223 | 137.347 |
| 0.6979166666666666 | 132.814 |
| 0.6986111111111111 | 128.284 |
| 0.6993055555555556 | 123.758 |
| 0.7000000000000001 | 123.758 |
| 0.7006944444444444 | 128.284 |
| 0.7013888888888888 | 128.284 |
| 0.7020833333333334 | 132.814 |
| 0.7027777777777778 | 141.884 |
| 0.7034722222222222 | 178.264 |
| 0.7041666666666666 | 196.497 |
| 0.7048611111111112 | 201.058 |
| 0.7055555555555556 | 196.497 |
| 0.7062499999999999 | 191.937 |
| 0.7069444444444444 | 187.378 |
| 0.7076388888888889 | 182.82 |
| 0.7083333333333334 | 182.82 |
| 0.7090277777777777 | 178.264 |
| 0.7097222222222223 | 173.709 |
| 0.7104166666666667 | 169.156 |
| 0.7111111111111111 | 164.605 |
| 0.7118055555555555 | 155.509 |
| 0.7125 | 137.347 |
| 0.7131944444444445 | 123.758 |
| 0.7138888888888889 | 137.347 |
| 0.7145833333333332 | 141.884 |
| 0.7152777777777778 | 141.884 |
| 0.7159722222222222 | 137.347 |
| 0.7166666666666667 | 137.347 |
| 0.717361111111111 | 132.814 |
| 0.7180555555555556 | 123.758 |
| 0.71875 | 114.716 |
| 0.7194444444444444 | 92.184 |
| 0.720138888888889 | 87.692 |
| 0.7208333333333333 | 83.205 |
| 0.7215277777777778 | 74.246 |
| 0.7222222222222222 | 74.246 |
| 0.7229166666666668 | 69.775 |
| 0.7236111111111111 | 69.775 |
| 0.7243055555555555 | 65.31 |
| 0.725 | 65.31 |
| 0.7256944444444445 | 65.31 |
| 0.7263888888888889 | 60.85 |
| 0.7270833333333333 | 65.31 |
| 0.7277777777777777 | 60.85 |
| 0.7284722222222223 | 69.775 |
| 0.7291666666666666 | 69.775 |
| 0.7298611111111111 | 69.775 |
| 0.7305555555555556 | 65.31 |
| 0.7312500000000001 | 65.31 |
| 0.7319444444444444 | 69.775 |
| 0.7326388888888888 | 65.31 |
| 0.7333333333333334 | 65.31 |
| 0.7340277777777778 | 65.31 |
| 0.7347222222222222 | 60.85 |
| 0.7354166666666666 | 56.398 |
| 0.7361111111111112 | 51.951 |
| 0.7368055555555556 | 47.511 |
| 0.7374999999999999 | 43.079 |
| 0.7381944444444444 | 43.079 |
| 0.7388888888888889 | 38.653 |
| 0.7395833333333334 | 38.653 |
| 0.7402777777777777 | 38.653 |
| 0.7409722222222223 | 34.234 |
| 0.7416666666666667 | 34.234 |
| 0.7423611111111111 | 34.234 |
| 0.7430555555555555 | 29.823 |
| 0.74375 | 29.823 |
| 0.7444444444444445 | 29.823 |
| 0.7451388888888889 | 29.823 |
| 0.7458333333333332 | 29.823 |
| 0.7465277777777778 | 29.823 |
| 0.7472222222222222 | 25.419 |
| 0.7479166666666667 | 25.419 |
| 0.748611111111111 | 21.024 |
| 0.7493055555555556 | 21.024 |
| 0.75 | 21.024 |
| 0.7506944444444444 | 16.636 |
| 0.751388888888889 | 16.636 |
| 0.7520833333333333 | 16.636 |
| 0.7527777777777778 | 16.636 |
| 0.7534722222222222 | 16.636 |
| 0.7541666666666668 | 16.636 |
| 0.7548611111111111 | 16.636 |
| 0.7555555555555555 | 12.257 |
| 0.75625 | 12.257 |
| 0.7569444444444445 | 12.257 |
| 0.7576388888888889 | 12.257 |
| 0.7583333333333333 | 12.257 |
| 0.7590277777777777 | 12.257 |
| 0.7597222222222223 | 12.257 |
| 0.7604166666666666 | 12.257 |
| 0.7611111111111111 | 7.887 |
| 0.7618055555555556 | 7.887 |
| 0.7625000000000001 | 7.887 |
| 0.7631944444444444 | 7.887 |
| 0.7638888888888888 | 7.887 |
| 0.7645833333333334 | 7.887 |
| 0.7652777777777778 | 7.887 |
| 0.7659722222222222 | 3.525 |
| 0.7666666666666666 | 3.525 |
| 0.7673611111111112 | 3.525 |
| 0.7680555555555556 | 3.525 |
| 0.7687499999999999 | 3.525 |
| 0.7694444444444444 | 3.525 |
| 0.7701388888888889 | 3.525 |
| 0.7708333333333334 | 3.525 |
| 0.7715277777777777 | 3.525 |
| 0.7722222222222223 | 3.525 |
| 0.7729166666666667 | 0 |
| 0.7736111111111111 | 0 |
| 0.7743055555555555 | 0 |
| 0.775 | 0 |
| 0.7756944444444445 | 0 |
| 0.7763888888888889 | 0 |
| 0.7770833333333332 | 0 |
| 0.7777777777777778 | 0 |
| 0.7784722222222222 | 0 |
| 0.7791666666666667 | 0 |
| 0.779861111111111 | 0 |
| 0.7805555555555556 | 0 |
| 0.78125 | 0 |
| 0.7819444444444444 | 0 |
| 0.782638888888889 | 0 |
| 0.7833333333333333 | 0 |
| 0.7840277777777778 | 0 |
| 0.7847222222222222 | 0 |
| 0.7854166666666668 | 0 |
| 0.7861111111111111 | 0 |
| 0.7868055555555555 | 0 |
| 0.7875 | 0 |
| 0.7881944444444445 | 0 |
| 0.7888888888888889 | 0 |
| 0.7895833333333333 | 0 |
| 0.7902777777777777 | 0 |
| 0.7909722222222223 | 0 |
| 0.7916666666666666 | 0 |
| 0.7923611111111111 | 0 |
| 0.7930555555555556 | 0 |
| 0.7937500000000001 | 0 |
| 0.7944444444444444 | 0 |
| 0.7951388888888888 | 0 |
| 0.7958333333333334 | 0 |
| 0.7965277777777778 | 0 |
| 0.7972222222222222 | 0 |
| 0.7979166666666666 | 0 |
| 0.7986111111111112 | 0 |
| 0.7993055555555556 | 0 |
| 0.7999999999999999 | 0 |
| 0.8006944444444444 | 0 |
| 0.8013888888888889 | 0 |
| 0.8020833333333334 | 0 |
| 0.8027777777777777 | 0 |
| 0.8034722222222223 | 0 |
| 0.8041666666666667 | 0 |
| 0.8048611111111111 | 0 |
| 0.8055555555555555 | 0 |
| 0.80625 | 0 |
| 0.8069444444444445 | 0 |
| 0.8076388888888889 | 0 |
| 0.8083333333333332 | 0 |
| 0.8090277777777778 | 0 |
| 0.8097222222222222 | 0 |
| 0.8104166666666667 | 0 |
| 0.811111111111111 | 0 |
| 0.8118055555555556 | 0 |
| 0.8125 | 0 |
| 0.8131944444444444 | 0 |
| 0.813888888888889 | 0 |
| 0.8145833333333333 | 0 |
| 0.8152777777777778 | 0 |
| 0.8159722222222222 | 0 |
| 0.8166666666666668 | 0 |
| 0.8173611111111111 | 0 |
| 0.8180555555555555 | 0 |
| 0.81875 | 0 |
| 0.8194444444444445 | 0 |
| 0.8201388888888889 | 0 |
| 0.8208333333333333 | 0 |
| 0.8215277777777777 | 0 |
| 0.8222222222222223 | 0 |
| 0.8229166666666666 | 0 |
| 0.8236111111111111 | 0 |
| 0.8243055555555556 | 0 |
| 0.8250000000000001 | 0 |
| 0.8256944444444444 | 0 |
| 0.8263888888888888 | 0 |
| 0.8270833333333334 | 0 |
| 0.8277777777777778 | 0 |
| 0.8284722222222222 | 0 |
| 0.8291666666666666 | 0 |
| 0.8298611111111112 | 0 |
| 0.8305555555555556 | 0 |
| 0.8312499999999999 | 0 |
| 0.8319444444444444 | 0 |
| 0.8326388888888889 | 0 |
| 0.8333333333333334 | 0 |
| 0.8340277777777777 | 0 |
| 0.8347222222222223 | 0 |
| 0.8354166666666667 | 0 |
| 0.8361111111111111 | 0 |
| 0.8368055555555555 | 0 |
| 0.8375 | 0 |
| 0.8381944444444445 | 0 |
| 0.8388888888888889 | 0 |
| 0.8395833333333332 | 0 |
| 0.8402777777777778 | 0 |
| 0.8409722222222222 | 0 |
| 0.8416666666666667 | 0 |
| 0.842361111111111 | 0 |
| 0.8430555555555556 | 0 |
| 0.84375 | 0 |
| 0.8444444444444444 | 0 |
| 0.845138888888889 | 0 |
| 0.8458333333333333 | 0 |
| 0.8465277777777778 | 0 |
| 0.8472222222222222 | 0 |
| 0.8479166666666668 | 0 |
| 0.8486111111111111 | 0 |
| 0.8493055555555555 | 0 |
| 0.85 | 0 |
| 0.8506944444444445 | 0 |
| 0.8513888888888889 | 0 |
| 0.8520833333333333 | 0 |
| 0.8527777777777777 | 0 |
| 0.8534722222222223 | 0 |
| 0.8541666666666666 | 0 |
| 0.8548611111111111 | 0 |
| 0.8555555555555556 | 0 |
| 0.8562500000000001 | 0 |
| 0.8569444444444444 | 0 |
| 0.8576388888888888 | 0 |
| 0.8583333333333334 | 0 |
| 0.8590277777777778 | 0 |
| 0.8597222222222222 | 0 |
| 0.8604166666666666 | 0 |
| 0.8611111111111112 | 0 |
| 0.8618055555555556 | 0 |
| 0.8624999999999999 | 0 |
| 0.8631944444444444 | 0 |
| 0.8638888888888889 | 0 |
| 0.8645833333333334 | 0 |
| 0.8652777777777777 | 0 |
| 0.8659722222222223 | 0 |
| 0.8666666666666667 | 0 |
| 0.8673611111111111 | 0 |
| 0.8680555555555555 | 0 |
| 0.86875 | 0 |
| 0.8694444444444445 | 0 |
| 0.8701388888888889 | 0 |
| 0.8708333333333332 | 0 |
| 0.8715277777777778 | 0 |
| 0.8722222222222222 | 0 |
| 0.8729166666666667 | 0 |
| 0.873611111111111 | 0 |
| 0.8743055555555556 | 0 |
| 0.875 | 0 |
| 0.8756944444444444 | 0 |
| 0.876388888888889 | 0 |
| 0.8770833333333333 | 0 |
| 0.8777777777777778 | 0 |
| 0.8784722222222222 | 0 |
| 0.8791666666666668 | 0 |
| 0.8798611111111111 | 0 |
| 0.8805555555555555 | 0 |
| 0.88125 | 0 |
| 0.8819444444444445 | 0 |
| 0.8826388888888889 | 0 |
| 0.8833333333333333 | 0 |
| 0.8840277777777777 | 0 |
| 0.8847222222222223 | 0 |
| 0.8854166666666666 | 0 |
| 0.8861111111111111 | 0 |
| 0.8868055555555556 | 0 |
| 0.8875000000000001 | 0 |
| 0.8881944444444444 | 0 |
| 0.8888888888888888 | 0 |
| 0.8895833333333334 | 0 |
| 0.8902777777777778 | 0 |
| 0.8909722222222222 | 0 |
| 0.8916666666666666 | 0 |
| 0.8923611111111112 | 0 |
| 0.8930555555555556 | 0 |
| 0.8937499999999999 | 0 |
| 0.8944444444444444 | 0 |
| 0.8951388888888889 | 0 |
| 0.8958333333333334 | 0 |
| 0.8965277777777777 | 0 |
| 0.8972222222222223 | 0 |
| 0.8979166666666667 | 0 |
| 0.8986111111111111 | 0 |
| 0.8993055555555555 | 0 |
| 0.9 | 0 |
| 0.9006944444444445 | 0 |
| 0.9013888888888889 | 0 |
| 0.9020833333333332 | 0 |
| 0.9027777777777778 | 0 |
| 0.9034722222222222 | 0 |
| 0.9041666666666667 | 0 |
| 0.904861111111111 | 0 |
| 0.9055555555555556 | 0 |
| 0.90625 | 0 |
| 0.9069444444444444 | 0 |
| 0.907638888888889 | 0 |
| 0.9083333333333333 | 0 |
| 0.9090277777777778 | 0 |
| 0.9097222222222222 | 0 |
| 0.9104166666666668 | 0 |
| 0.9111111111111111 | 0 |
| 0.9118055555555555 | 0 |
| 0.9125 | 0 |
| 0.9131944444444445 | 0 |
| 0.9138888888888889 | 0 |
| 0.9145833333333333 | 0 |
| 0.9152777777777777 | 0 |
| 0.9159722222222223 | 0 |
| 0.9166666666666666 | 0 |
| 0.9173611111111111 | 0 |
| 0.9180555555555556 | 0 |
| 0.9187500000000001 | 0 |
| 0.9194444444444444 | 0 |
| 0.9201388888888888 | 0 |
| 0.9208333333333334 | 0 |
| 0.9215277777777778 | 0 |
| 0.9222222222222222 | 0 |
| 0.9229166666666666 | 0 |
| 0.9236111111111112 | 0 |
| 0.9243055555555556 | 0 |
| 0.9249999999999999 | 0 |
| 0.9256944444444444 | 0 |
| 0.9263888888888889 | 0 |
| 0.9270833333333334 | 0 |
| 0.9277777777777777 | 0 |
| 0.9284722222222223 | 0 |
| 0.9291666666666667 | 0 |
| 0.9298611111111111 | 0 |
| 0.9305555555555555 | 0 |
| 0.93125 | 0 |
| 0.9319444444444445 | 0 |
| 0.9326388888888889 | 0 |
| 0.9333333333333332 | 0 |
| 0.9340277777777778 | 0 |
| 0.9347222222222222 | 0 |
| 0.9354166666666667 | 0 |
| 0.936111111111111 | 0 |
| 0.9368055555555556 | 0 |
| 0.9375 | 0 |
| 0.9381944444444444 | 0 |
| 0.938888888888889 | 0 |
| 0.9395833333333333 | 0 |
| 0.9402777777777778 | 0 |
| 0.9409722222222222 | 0 |
| 0.9416666666666668 | 0 |
| 0.9423611111111111 | 0 |
| 0.9430555555555555 | 0 |
| 0.94375 | 0 |
| 0.9444444444444445 | 0 |
| 0.9451388888888889 | 0 |
| 0.9458333333333333 | 0 |
| 0.9465277777777777 | 0 |
| 0.9472222222222223 | 0 |
| 0.9479166666666666 | 0 |
| 0.9486111111111111 | 0 |
| 0.9493055555555556 | 0 |
| 0.9500000000000001 | 0 |
| 0.9506944444444444 | 0 |
| 0.9513888888888888 | 0 |
| 0.9520833333333334 | 0 |
| 0.9527777777777778 | 0 |
| 0.9534722222222222 | 0 |
| 0.9541666666666666 | 0 |
| 0.9548611111111112 | 0 |
| 0.9555555555555556 | 0 |
| 0.9562499999999999 | 0 |
| 0.9569444444444444 | 0 |
| 0.9576388888888889 | 0 |
| 0.9583333333333334 | 0 |
| 0.9590277777777777 | 0 |
| 0.9597222222222223 | 0 |
| 0.9604166666666667 | 0 |
| 0.9611111111111111 | 0 |
| 0.9618055555555555 | 0 |
| 0.9625 | 0 |
| 0.9631944444444445 | 0 |
| 0.9638888888888889 | 0 |
| 0.9645833333333332 | 0 |
| 0.9652777777777778 | 0 |
| 0.9659722222222222 | 0 |
| 0.9666666666666667 | 0 |
| 0.967361111111111 | 0 |
| 0.9680555555555556 | 0 |
| 0.96875 | 0 |
| 0.9694444444444444 | 0 |
| 0.970138888888889 | 0 |
| 0.9708333333333333 | 0 |
| 0.9715277777777778 | 0 |
| 0.9722222222222222 | 0 |
| 0.9729166666666668 | 0 |
| 0.9736111111111111 | 0 |
| 0.9743055555555555 | 0 |
| 0.975 | 0 |
| 0.9756944444444445 | 0 |
| 0.9763888888888889 | 0 |
| 0.9770833333333333 | 0 |
| 0.9777777777777777 | 0 |
| 0.9784722222222223 | 0 |
| 0.9791666666666666 | 0 |
| 0.9798611111111111 | 0 |
| 0.9805555555555556 | 0 |
| 0.9812500000000001 | 0 |
| 0.9819444444444444 | 0 |
| 0.9826388888888888 | 0 |
| 0.9833333333333334 | 0 |
| 0.9840277777777778 | 0 |
| 0.9847222222222222 | 0 |
| 0.9854166666666666 | 0 |
| 0.9861111111111112 | 0 |
| 0.9868055555555556 | 0 |
| 0.9874999999999999 | 0 |
| 0.9881944444444444 | 0 |
| 0.9888888888888889 | 0 |
| 0.9895833333333334 | 0 |
| 0.9902777777777777 | 0 |
| 0.9909722222222223 | 0 |
| 0.9916666666666667 | 0 |
| 0.9923611111111111 | 0 |
| 0.9930555555555555 | 0 |
| 0.99375 | 0 |
| 0.9944444444444445 | 0 |
| 0.9951388888888889 | 0 |
| 0.9958333333333332 | 0 |
| 0.9965277777777778 | 0 |
| 0.9972222222222222 | 0 |
| 0.9979166666666667 | 0 |
| 0.998611111111111 | 0 |
| 0.9993055555555556 | 0 |